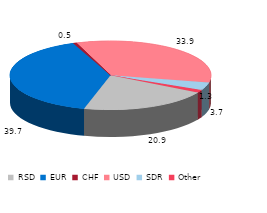
| Category | Series 0 |
|---|---|
| RSD | 20.877 |
| EUR | 39.733 |
| CHF | 0.5 |
| USD | 33.868 |
| SDR | 3.652 |
| Other  | 1.314 |